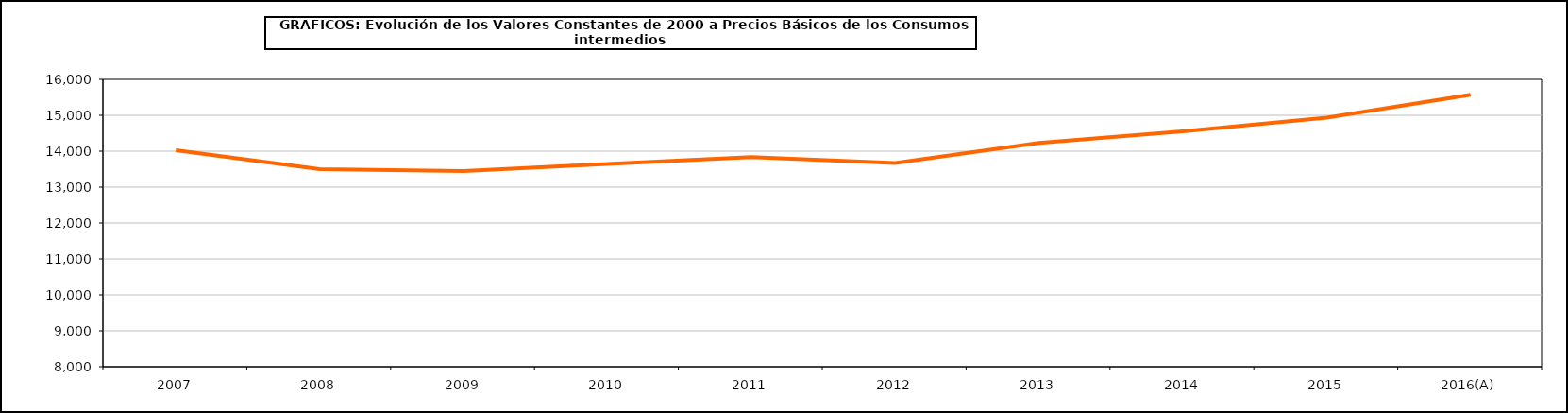
| Category | Total consumos intermedios |
|---|---|
| 2007 | 14024.9 |
| 2008 | 13501.9 |
| 2009 | 13446.9 |
| 2010 | 13642 |
| 2011 | 13835.8 |
| 2012 | 13669.3 |
| 2013 | 14227.7 |
| 2014 | 14550.6 |
| 2015 | 14933.8 |
| 2016(A) | 15570.9 |